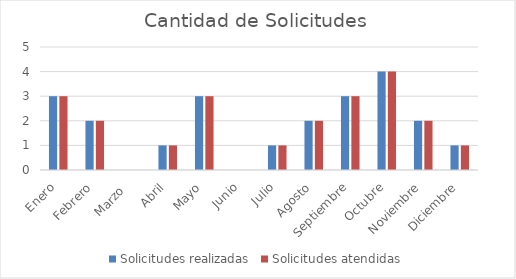
| Category | Solicitudes realizadas | Solicitudes atendidas |
|---|---|---|
| Enero | 3 | 3 |
| Febrero | 2 | 2 |
| Marzo  | 0 | 0 |
| Abril | 1 | 1 |
| Mayo | 3 | 3 |
| Junio | 0 | 0 |
| Julio | 1 | 1 |
| Agosto | 2 | 2 |
| Septiembre | 3 | 3 |
| Octubre | 4 | 4 |
| Noviembre | 2 | 2 |
| Diciembre | 1 | 1 |